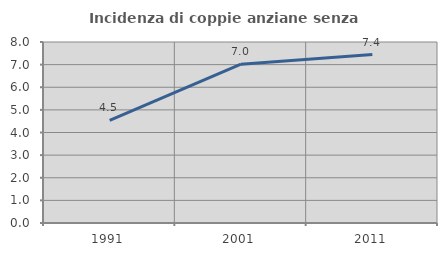
| Category | Incidenza di coppie anziane senza figli  |
|---|---|
| 1991.0 | 4.538 |
| 2001.0 | 7.021 |
| 2011.0 | 7.444 |